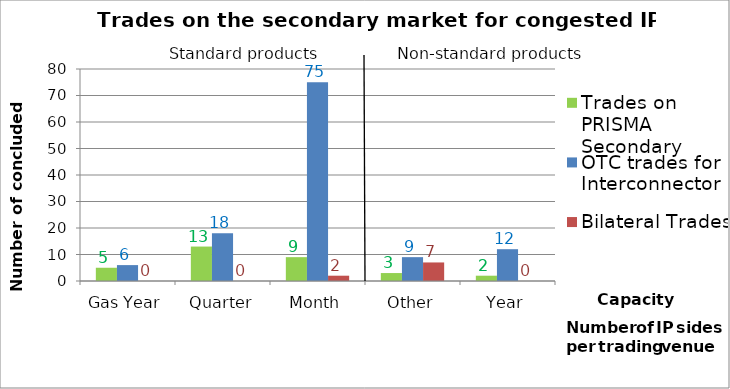
| Category | Trades on PRISMA Secondary | OTC trades for Interconnector | Bilateral Trades |
|---|---|---|---|
| Gas Year | 5 | 6 | 0 |
| Quarter | 13 | 18 | 0 |
| Month | 9 | 75 | 2 |
| Other | 3 | 9 | 7 |
| Year | 2 | 12 | 0 |